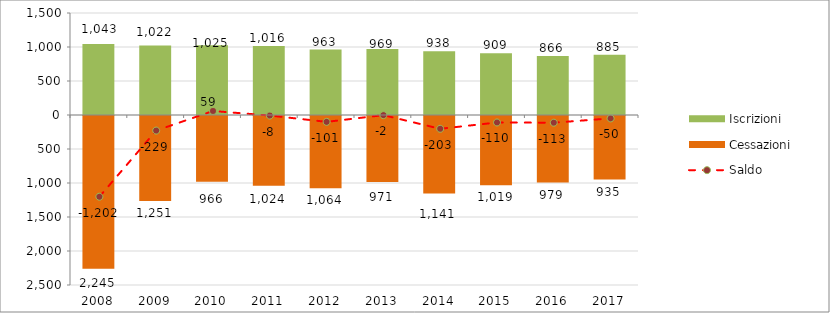
| Category | Iscrizioni | Cessazioni |
|---|---|---|
| 2008.0 | 1043 | -2245 |
| 2009.0 | 1022 | -1251 |
| 2010.0 | 1025 | -966 |
| 2011.0 | 1016 | -1024 |
| 2012.0 | 963 | -1064 |
| 2013.0 | 969 | -971 |
| 2014.0 | 938 | -1141 |
| 2015.0 | 909 | -1019 |
| 2016.0 | 866 | -979 |
| 2017.0 | 885 | -935 |